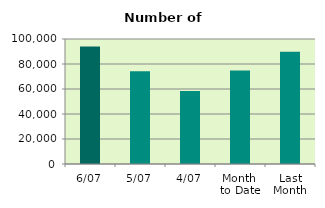
| Category | Series 0 |
|---|---|
| 6/07 | 94074 |
| 5/07 | 74244 |
| 4/07 | 58478 |
| Month 
to Date | 74778 |
| Last
Month | 89884.909 |